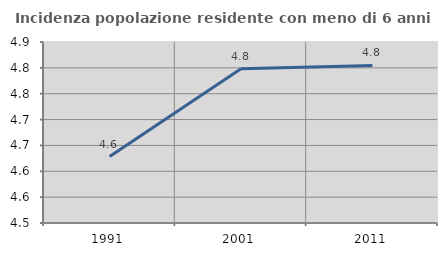
| Category | Incidenza popolazione residente con meno di 6 anni |
|---|---|
| 1991.0 | 4.628 |
| 2001.0 | 4.798 |
| 2011.0 | 4.805 |